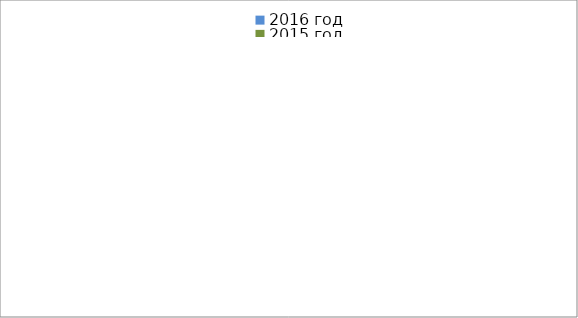
| Category | 2016 год | 2015 год |
|---|---|---|
|  - поджог | 29 | 22 |
|  - неосторожное обращение с огнём | 21 | 42 |
|  - НПТЭ электрооборудования | 17 | 9 |
|  - НПУ и Э печей | 29 | 35 |
|  - НПУ и Э транспортных средств | 23 | 35 |
|   -Шалость с огнем детей | 6 | 3 |
|  -НППБ при эксплуатации эл.приборов | 10 | 12 |
|  - курение | 12 | 19 |
| - прочие | 66 | 73 |
| - не установленные причины | 12 | 9 |